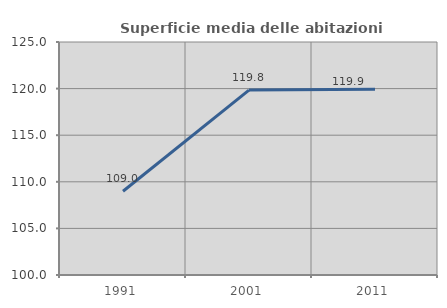
| Category | Superficie media delle abitazioni occupate |
|---|---|
| 1991.0 | 108.985 |
| 2001.0 | 119.844 |
| 2011.0 | 119.928 |